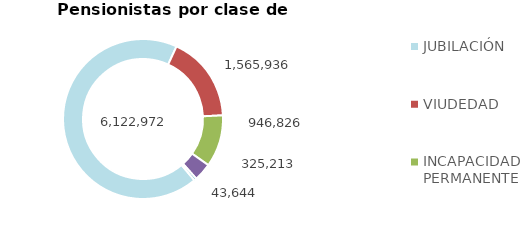
| Category | Series 0 |
|---|---|
| JUBILACIÓN | 6122972 |
| VIUDEDAD | 1565936 |
| INCAPACIDAD PERMANENTE | 946826 |
| ORFANDAD | 325213 |
| FAVOR DE FAMILIARES | 43644 |